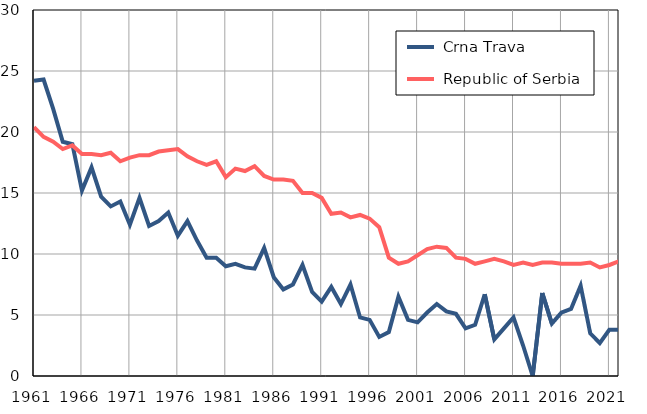
| Category |  Crna Trava |  Republic of Serbia |
|---|---|---|
| 1961.0 | 24.2 | 20.4 |
| 1962.0 | 24.3 | 19.6 |
| 1963.0 | 21.9 | 19.2 |
| 1964.0 | 19.2 | 18.6 |
| 1965.0 | 19 | 18.9 |
| 1966.0 | 15.2 | 18.2 |
| 1967.0 | 17.1 | 18.2 |
| 1968.0 | 14.7 | 18.1 |
| 1969.0 | 13.9 | 18.3 |
| 1970.0 | 14.3 | 17.6 |
| 1971.0 | 12.4 | 17.9 |
| 1972.0 | 14.6 | 18.1 |
| 1973.0 | 12.3 | 18.1 |
| 1974.0 | 12.7 | 18.4 |
| 1975.0 | 13.4 | 18.5 |
| 1976.0 | 11.5 | 18.6 |
| 1977.0 | 12.7 | 18 |
| 1978.0 | 11.1 | 17.6 |
| 1979.0 | 9.7 | 17.3 |
| 1980.0 | 9.7 | 17.6 |
| 1981.0 | 9 | 16.3 |
| 1982.0 | 9.2 | 17 |
| 1983.0 | 8.9 | 16.8 |
| 1984.0 | 8.8 | 17.2 |
| 1985.0 | 10.5 | 16.4 |
| 1986.0 | 8.1 | 16.1 |
| 1987.0 | 7.1 | 16.1 |
| 1988.0 | 7.5 | 16 |
| 1989.0 | 9.1 | 15 |
| 1990.0 | 6.9 | 15 |
| 1991.0 | 6.1 | 14.6 |
| 1992.0 | 7.3 | 13.3 |
| 1993.0 | 5.9 | 13.4 |
| 1994.0 | 7.5 | 13 |
| 1995.0 | 4.8 | 13.2 |
| 1996.0 | 4.6 | 12.9 |
| 1997.0 | 3.2 | 12.2 |
| 1998.0 | 3.6 | 9.7 |
| 1999.0 | 6.5 | 9.2 |
| 2000.0 | 4.6 | 9.4 |
| 2001.0 | 4.4 | 9.9 |
| 2002.0 | 5.2 | 10.4 |
| 2003.0 | 5.9 | 10.6 |
| 2004.0 | 5.3 | 10.5 |
| 2005.0 | 5.1 | 9.7 |
| 2006.0 | 3.9 | 9.6 |
| 2007.0 | 4.2 | 9.2 |
| 2008.0 | 6.7 | 9.4 |
| 2009.0 | 3 | 9.6 |
| 2010.0 | 3.9 | 9.4 |
| 2011.0 | 4.8 | 9.1 |
| 2012.0 | 2.5 | 9.3 |
| 2013.0 | 0 | 9.1 |
| 2014.0 | 6.8 | 9.3 |
| 2015.0 | 4.3 | 9.3 |
| 2016.0 | 5.2 | 9.2 |
| 2017.0 | 5.5 | 9.2 |
| 2018.0 | 7.4 | 9.2 |
| 2019.0 | 3.5 | 9.3 |
| 2020.0 | 2.7 | 8.9 |
| 2021.0 | 3.8 | 9.1 |
| 2022.0 | 3.8 | 9.4 |